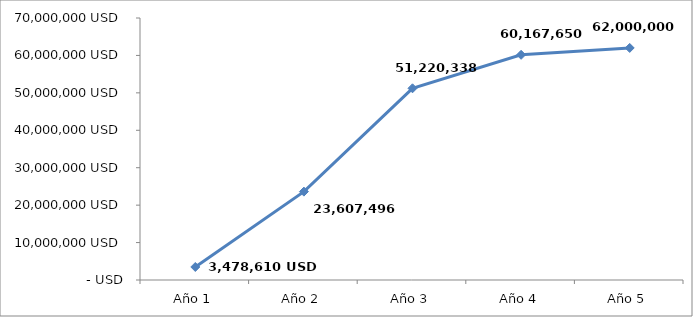
| Category | Series 0 |
|---|---|
| Año 1 | 3478610 |
| Año 2 | 23607495.8 |
| Año 3 | 51220338 |
| Año 4 | 60167650 |
| Año 5 | 62000000 |